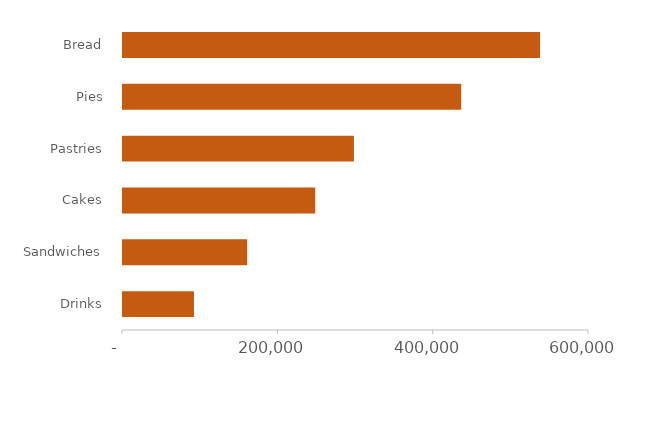
| Category | Series 0 |
|---|---|
|  Drinks  | 91356 |
|  Sandwiches  | 159866 |
|  Cakes  | 247550 |
|  Pastries  | 297320 |
|  Pies  | 435486 |
|  Bread  | 536978 |